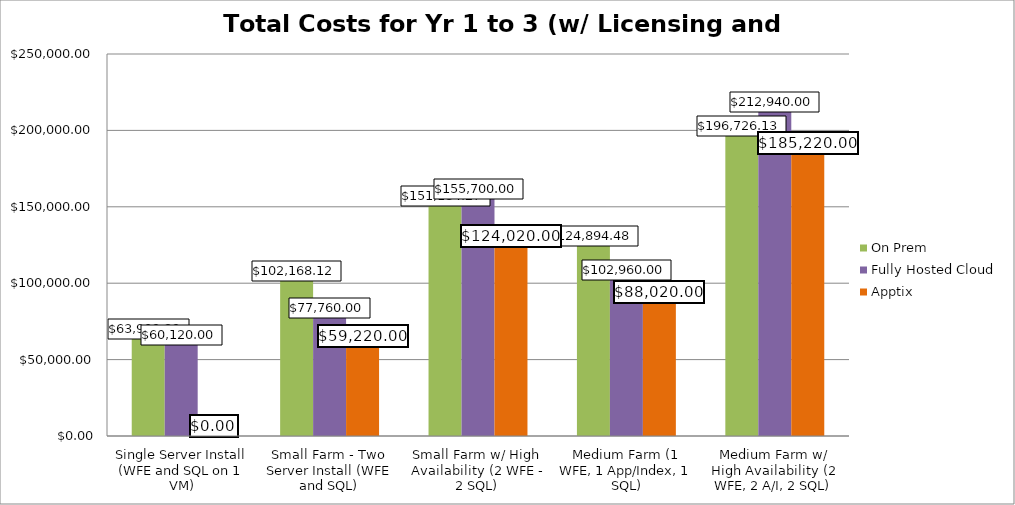
| Category | On Prem | Fully Hosted Cloud | Apptix |
|---|---|---|---|
| Single Server Install (WFE and SQL on 1 VM) | 63909.386 | 60120 | 0 |
| Small Farm - Two Server Install (WFE and SQL) | 102168.123 | 77760 | 59220 |
| Small Farm w/ High Availability (2 WFE - 2 SQL) | 151184.274 | 155700 | 124020 |
| Medium Farm (1 WFE, 1 App/Index, 1 SQL) | 124894.484 | 102960 | 88020 |
| Medium Farm w/ High Availability (2 WFE, 2 A/I, 2 SQL) | 196726.13 | 212940 | 185220 |